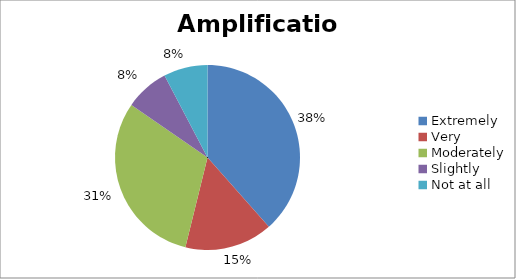
| Category | Amplification |
|---|---|
| Extremely | 5 |
| Very | 2 |
| Moderately | 4 |
| Slightly | 1 |
| Not at all | 1 |